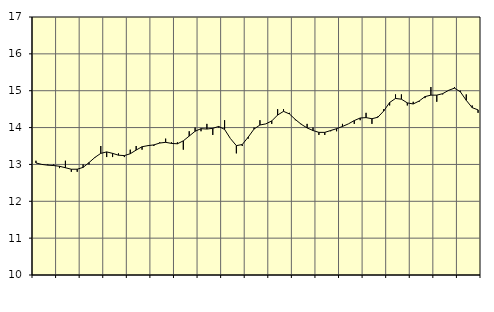
| Category | Piggar | Handel, SNI 45-47 |
|---|---|---|
| nan | 13.1 | 13.04 |
| 1.0 | 13 | 13 |
| 1.0 | 13 | 12.98 |
| 1.0 | 13 | 12.97 |
| nan | 12.9 | 12.95 |
| 2.0 | 13.1 | 12.91 |
| 2.0 | 12.8 | 12.87 |
| 2.0 | 12.8 | 12.87 |
| nan | 13 | 12.92 |
| 3.0 | 13 | 13.05 |
| 3.0 | 13.2 | 13.19 |
| 3.0 | 13.5 | 13.3 |
| nan | 13.2 | 13.34 |
| 4.0 | 13.2 | 13.3 |
| 4.0 | 13.3 | 13.25 |
| 4.0 | 13.2 | 13.24 |
| nan | 13.4 | 13.29 |
| 5.0 | 13.5 | 13.39 |
| 5.0 | 13.4 | 13.48 |
| 5.0 | 13.5 | 13.51 |
| nan | 13.5 | 13.53 |
| 6.0 | 13.6 | 13.58 |
| 6.0 | 13.7 | 13.6 |
| 6.0 | 13.6 | 13.57 |
| nan | 13.6 | 13.56 |
| 7.0 | 13.4 | 13.64 |
| 7.0 | 13.9 | 13.77 |
| 7.0 | 14 | 13.9 |
| nan | 13.9 | 13.97 |
| 8.0 | 14.1 | 13.96 |
| 8.0 | 13.8 | 13.98 |
| 8.0 | 14 | 14.03 |
| nan | 14.2 | 13.95 |
| 9.0 | 13.7 | 13.7 |
| 9.0 | 13.3 | 13.51 |
| 9.0 | 13.5 | 13.54 |
| nan | 13.7 | 13.74 |
| 10.0 | 14 | 13.96 |
| 10.0 | 14.2 | 14.07 |
| 10.0 | 14.1 | 14.1 |
| nan | 14.1 | 14.18 |
| 11.0 | 14.5 | 14.34 |
| 11.0 | 14.5 | 14.44 |
| 11.0 | 14.4 | 14.37 |
| nan | 14.2 | 14.22 |
| 12.0 | 14.1 | 14.09 |
| 12.0 | 14.1 | 13.99 |
| 12.0 | 14 | 13.92 |
| nan | 13.8 | 13.87 |
| 13.0 | 13.8 | 13.87 |
| 13.0 | 13.9 | 13.92 |
| 13.0 | 13.9 | 13.97 |
| nan | 14.1 | 14.03 |
| 14.0 | 14.1 | 14.1 |
| 14.0 | 14.1 | 14.19 |
| 14.0 | 14.2 | 14.26 |
| nan | 14.4 | 14.27 |
| 15.0 | 14.1 | 14.24 |
| 15.0 | 14.3 | 14.28 |
| 15.0 | 14.5 | 14.45 |
| nan | 14.6 | 14.68 |
| 16.0 | 14.9 | 14.79 |
| 16.0 | 14.9 | 14.77 |
| 16.0 | 14.6 | 14.67 |
| nan | 14.7 | 14.64 |
| 17.0 | 14.7 | 14.72 |
| 17.0 | 14.8 | 14.84 |
| 17.0 | 15.1 | 14.88 |
| nan | 14.7 | 14.88 |
| 18.0 | 14.9 | 14.92 |
| 18.0 | 15 | 15.01 |
| 18.0 | 15.1 | 15.07 |
| nan | 15 | 14.97 |
| 19.0 | 14.9 | 14.74 |
| 19.0 | 14.6 | 14.54 |
| 19.0 | 14.4 | 14.48 |